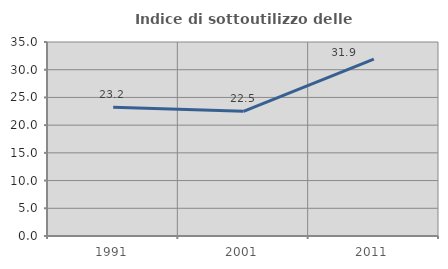
| Category | Indice di sottoutilizzo delle abitazioni  |
|---|---|
| 1991.0 | 23.23 |
| 2001.0 | 22.494 |
| 2011.0 | 31.919 |